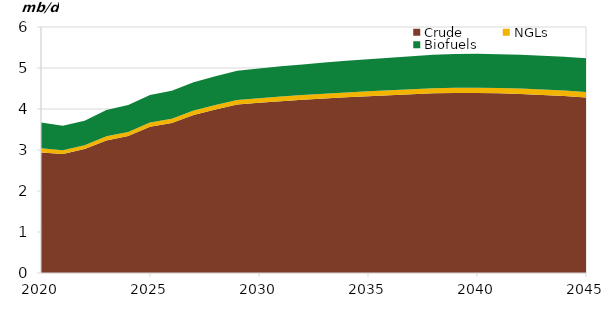
| Category | Crude | NGLs | Biofuels |
|---|---|---|---|
| 2020-01-01 | 2.94 | 0.1 | 0.634 |
| 2021-01-01 | 2.905 | 0.091 | 0.594 |
| 2022-01-01 | 3.022 | 0.092 | 0.602 |
| 2023-01-01 | 3.235 | 0.098 | 0.641 |
| 2024-01-01 | 3.338 | 0.1 | 0.659 |
| 2025-01-01 | 3.568 | 0.103 | 0.668 |
| 2026-01-01 | 3.659 | 0.106 | 0.677 |
| 2027-01-01 | 3.856 | 0.108 | 0.687 |
| 2028-01-01 | 3.988 | 0.11 | 0.698 |
| 2029-01-01 | 4.109 | 0.112 | 0.711 |
| 2030-01-01 | 4.15 | 0.114 | 0.725 |
| 2031-01-01 | 4.188 | 0.116 | 0.736 |
| 2032-01-01 | 4.223 | 0.118 | 0.747 |
| 2033-01-01 | 4.255 | 0.119 | 0.758 |
| 2034-01-01 | 4.285 | 0.121 | 0.769 |
| 2035-01-01 | 4.312 | 0.122 | 0.78 |
| 2036-01-01 | 4.337 | 0.123 | 0.791 |
| 2037-01-01 | 4.36 | 0.125 | 0.802 |
| 2038-01-01 | 4.381 | 0.126 | 0.813 |
| 2039-01-01 | 4.391 | 0.127 | 0.824 |
| 2040-01-01 | 4.392 | 0.129 | 0.824 |
| 2041-01-01 | 4.383 | 0.13 | 0.824 |
| 2042-01-01 | 4.367 | 0.131 | 0.824 |
| 2043-01-01 | 4.344 | 0.133 | 0.824 |
| 2044-01-01 | 4.314 | 0.134 | 0.824 |
| 2045-01-01 | 4.279 | 0.135 | 0.824 |